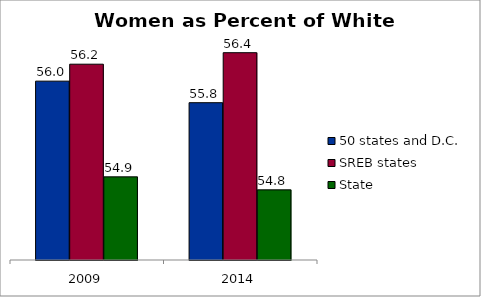
| Category | 50 states and D.C. | SREB states | State |
|---|---|---|---|
| 2009 | 56.032 | 56.225 | 54.945 |
| 2014 | 55.788 | 56.356 | 54.797 |